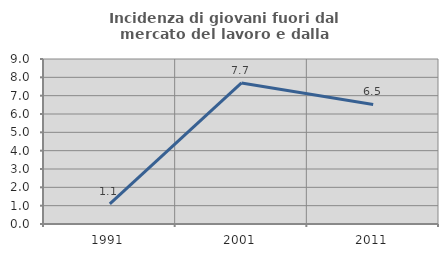
| Category | Incidenza di giovani fuori dal mercato del lavoro e dalla formazione  |
|---|---|
| 1991.0 | 1.099 |
| 2001.0 | 7.692 |
| 2011.0 | 6.522 |